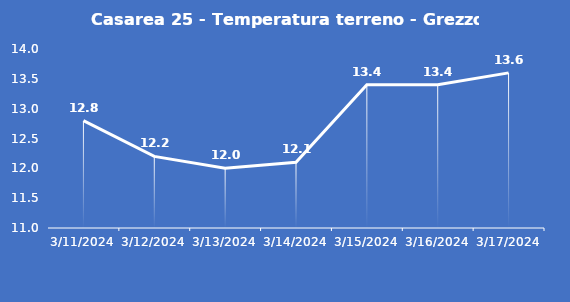
| Category | Casarea 25 - Temperatura terreno - Grezzo (°C) |
|---|---|
| 3/11/24 | 12.8 |
| 3/12/24 | 12.2 |
| 3/13/24 | 12 |
| 3/14/24 | 12.1 |
| 3/15/24 | 13.4 |
| 3/16/24 | 13.4 |
| 3/17/24 | 13.6 |